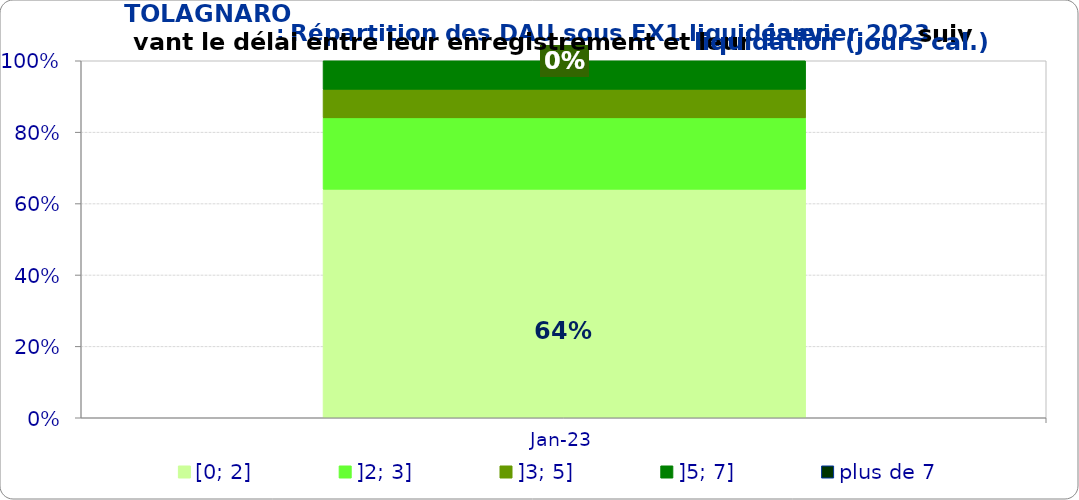
| Category | [0; 2] | ]2; 3] | ]3; 5] | ]5; 7] | plus de 7 |
|---|---|---|---|---|---|
| 2023-01-01 | 0.64 | 0.2 | 0.08 | 0.08 | 0 |